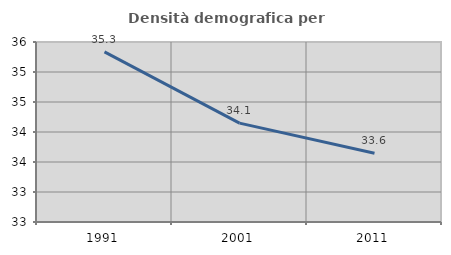
| Category | Densità demografica |
|---|---|
| 1991.0 | 35.335 |
| 2001.0 | 34.148 |
| 2011.0 | 33.646 |